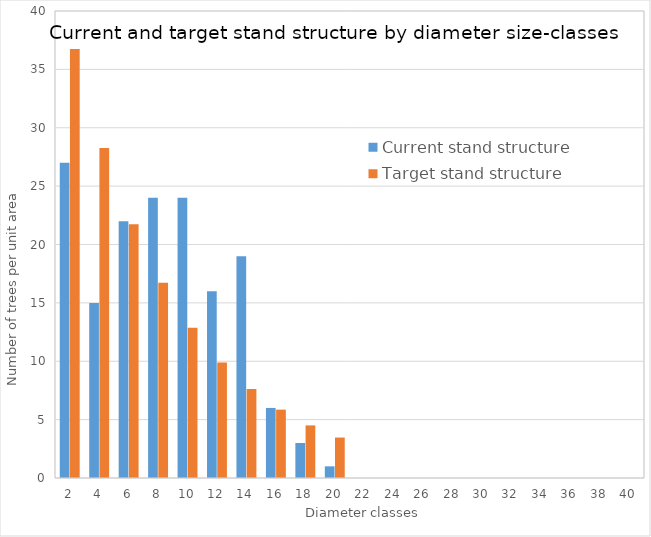
| Category | Current stand structure | Target stand structure |
|---|---|---|
| 2.0 | 27 | 36.745 |
| 4.0 | 15 | 28.266 |
| 6.0 | 22 | 21.743 |
| 8.0 | 24 | 16.725 |
| 10.0 | 24 | 12.866 |
| 12.0 | 16 | 9.897 |
| 14.0 | 19 | 7.613 |
| 16.0 | 6 | 5.856 |
| 18.0 | 3 | 4.505 |
| 20.0 | 1 | 3.465 |
| 22.0 | 0 | 0 |
| 24.0 | 0 | 0 |
| 26.0 | 0 | 0 |
| 28.0 | 0 | 0 |
| 30.0 | 0 | 0 |
| 32.0 | 0 | 0 |
| 34.0 | 0 | 0 |
| 36.0 | 0 | 0 |
| 38.0 | 0 | 0 |
| 40.0 | 0 | 0 |